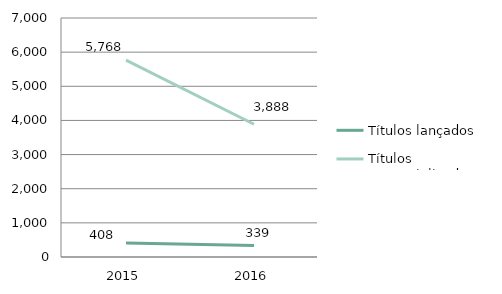
| Category | Títulos lançados | Títulos comercializados |
|---|---|---|
| 2015.0 | 408 | 5768 |
| 2016.0 | 339 | 3888 |